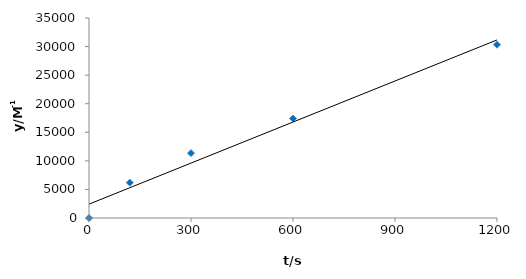
| Category | Series 0 |
|---|---|
| 0.0 | 0 |
| 120.0 | 6190.865 |
| 300.0 | 11354.076 |
| 600.0 | 17404.643 |
| 1200.0 | 30325.187 |